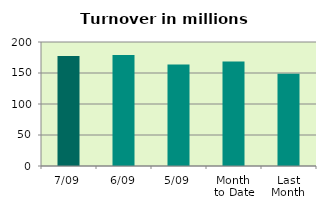
| Category | Series 0 |
|---|---|
| 7/09 | 177.306 |
| 6/09 | 178.881 |
| 5/09 | 163.545 |
| Month 
to Date | 168.518 |
| Last
Month | 148.736 |